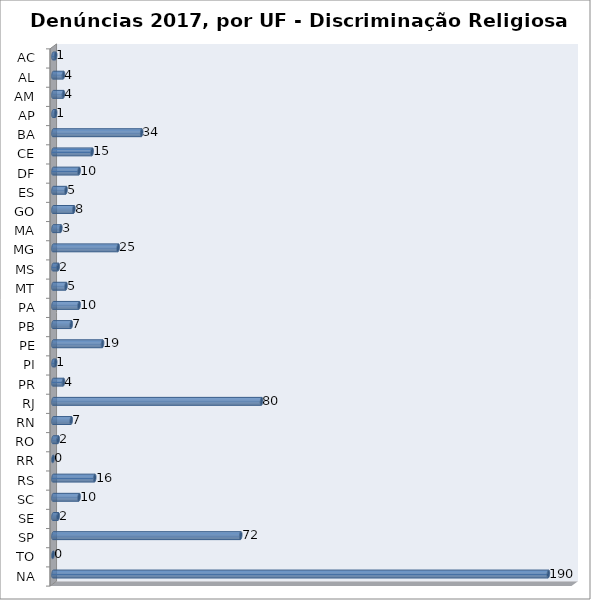
| Category | Series 0 |
|---|---|
| AC | 1 |
| AL | 4 |
| AM | 4 |
| AP | 1 |
| BA | 34 |
| CE | 15 |
| DF | 10 |
| ES | 5 |
| GO | 8 |
| MA | 3 |
| MG | 25 |
| MS | 2 |
| MT | 5 |
| PA | 10 |
| PB | 7 |
| PE | 19 |
| PI | 1 |
| PR | 4 |
| RJ | 80 |
| RN | 7 |
| RO | 2 |
| RR | 0 |
| RS | 16 |
| SC | 10 |
| SE | 2 |
| SP | 72 |
| TO | 0 |
| NA | 190 |